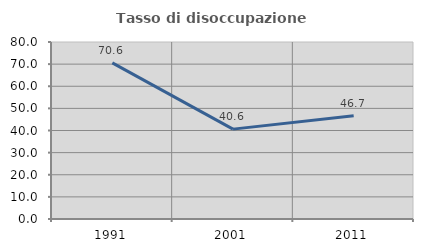
| Category | Tasso di disoccupazione giovanile  |
|---|---|
| 1991.0 | 70.588 |
| 2001.0 | 40.625 |
| 2011.0 | 46.667 |